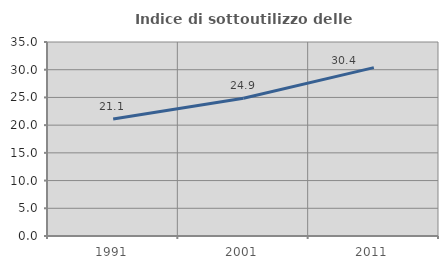
| Category | Indice di sottoutilizzo delle abitazioni  |
|---|---|
| 1991.0 | 21.121 |
| 2001.0 | 24.855 |
| 2011.0 | 30.374 |